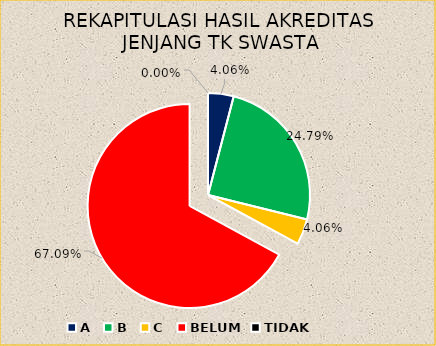
| Category | REKAPITULASI HASIL AKREDITASI JENJANG TK SWASTA |
|---|---|
| A | 19 |
| B | 116 |
| C | 19 |
| BELUM | 314 |
| TIDAK | 0 |